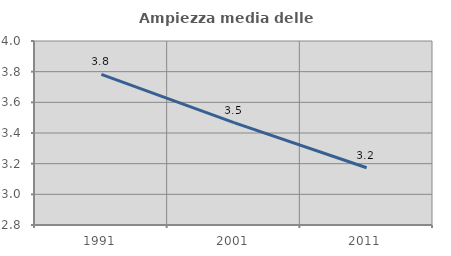
| Category | Ampiezza media delle famiglie |
|---|---|
| 1991.0 | 3.782 |
| 2001.0 | 3.468 |
| 2011.0 | 3.173 |